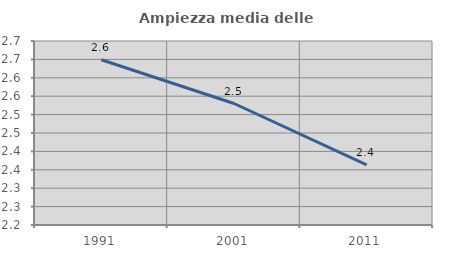
| Category | Ampiezza media delle famiglie |
|---|---|
| 1991.0 | 2.649 |
| 2001.0 | 2.53 |
| 2011.0 | 2.363 |